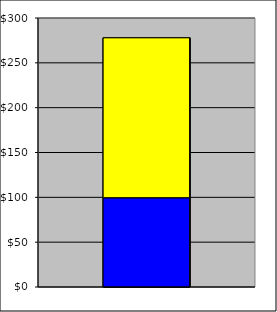
| Category | Series 0 | Series 1 |
|---|---|---|
| 0 | 99.627 | 178.273 |